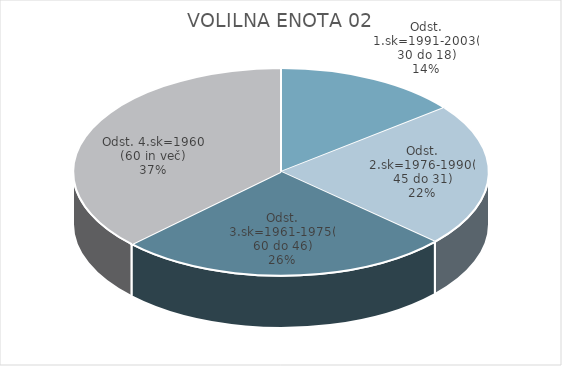
| Category | VOLILNA ENOTA 2 |
|---|---|
| Odst. 1.sk=1991-2003(30 do 18) | 6.98 |
| Odst. 2.sk=1976-1990(45 do 31) | 10.84 |
| Odst. 3.sk=1961-1975(60 do 46) | 12.6 |
| Odst. 4.sk=1960 (60 in več) | 18.07 |